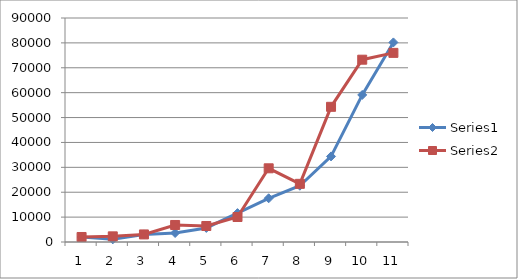
| Category | Series 0 | Series 1 |
|---|---|---|
| 0 | 2000 | 2012 |
| 1 | 1061.32 | 2267.08 |
| 2 | 3039.52 | 3039.52 |
| 3 | 3617.28 | 6838.92 |
| 4 | 5652 | 6430.72 |
| 5 | 11611.72 | 10048 |
| 6 | 17566.633 | 29610.898 |
| 7 | 22608 | 23367.88 |
| 8 | 34389.28 | 54315.72 |
| 9 | 59088.52 | 73249.92 |
| 10 | 80189.32 | 75988 |